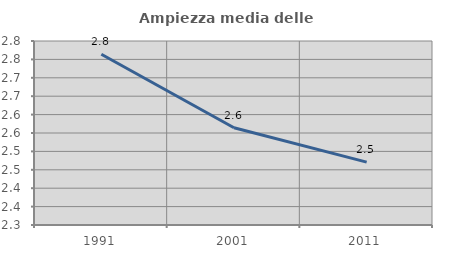
| Category | Ampiezza media delle famiglie |
|---|---|
| 1991.0 | 2.764 |
| 2001.0 | 2.564 |
| 2011.0 | 2.471 |